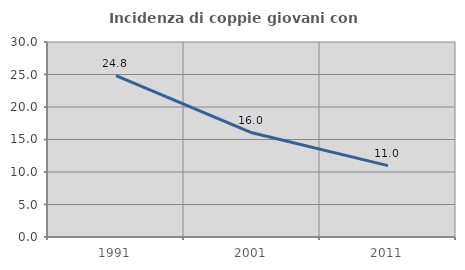
| Category | Incidenza di coppie giovani con figli |
|---|---|
| 1991.0 | 24.828 |
| 2001.0 | 16.034 |
| 2011.0 | 10.981 |